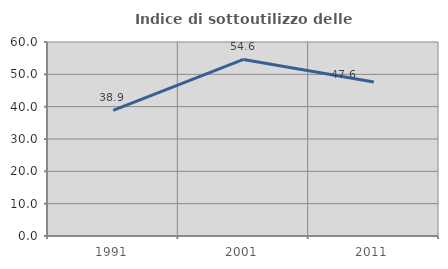
| Category | Indice di sottoutilizzo delle abitazioni  |
|---|---|
| 1991.0 | 38.869 |
| 2001.0 | 54.608 |
| 2011.0 | 47.632 |